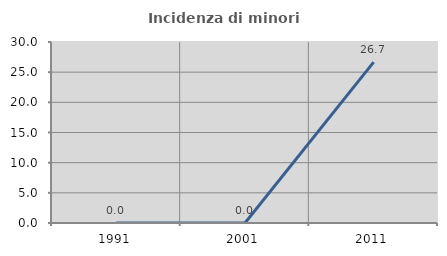
| Category | Incidenza di minori stranieri |
|---|---|
| 1991.0 | 0 |
| 2001.0 | 0 |
| 2011.0 | 26.667 |